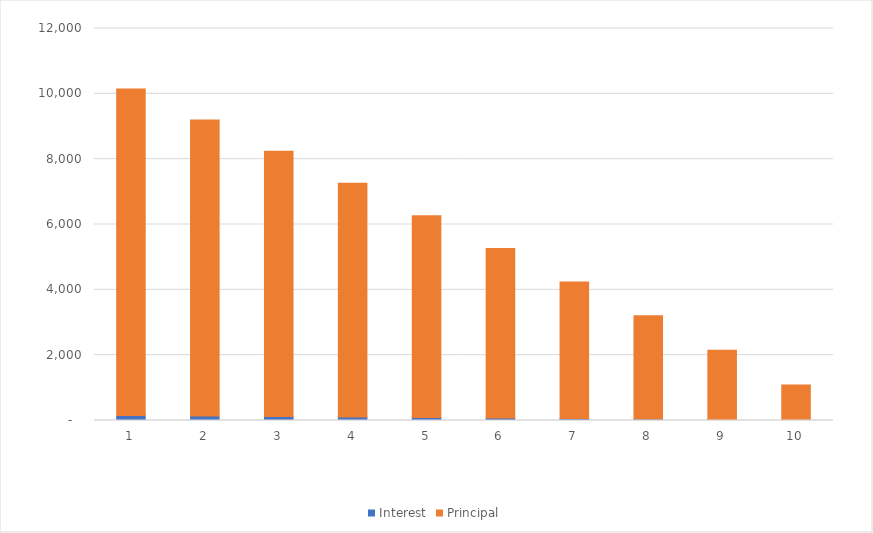
| Category | Interest | Principal |
|---|---|---|
| 0 | 151.233 | 10000 |
| 1 | 134.875 | 9066.183 |
| 2 | 122.76 | 8117.299 |
| 3 | 107.033 | 7155.135 |
| 4 | 93.431 | 6177.936 |
| 5 | 77.158 | 5186.528 |
| 6 | 63.21 | 4179.63 |
| 7 | 46.983 | 3158.13 |
| 8 | 32.075 | 2120.926 |
| 9 | 15.895 | 1068.422 |